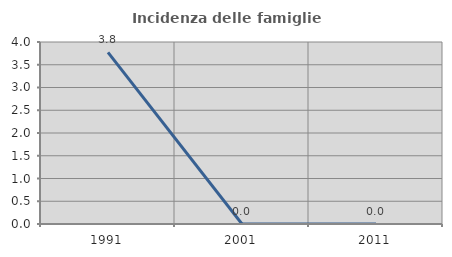
| Category | Incidenza delle famiglie numerose |
|---|---|
| 1991.0 | 3.774 |
| 2001.0 | 0 |
| 2011.0 | 0 |